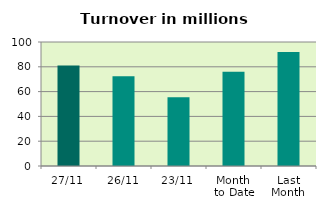
| Category | Series 0 |
|---|---|
| 27/11 | 80.978 |
| 26/11 | 72.353 |
| 23/11 | 55.413 |
| Month 
to Date | 76.001 |
| Last
Month | 91.964 |